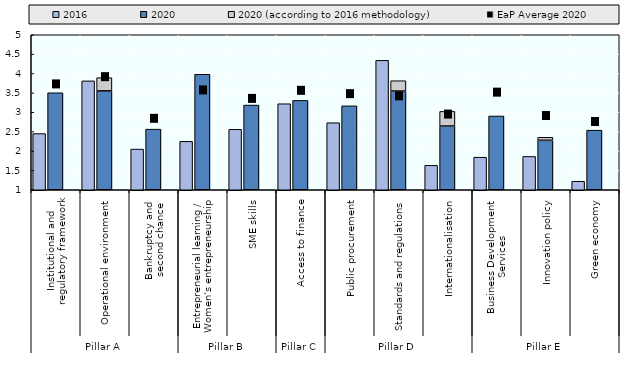
| Category | 2020 | 2020 (according to 2016 methodology) |
|---|---|---|
| 0 | 3.503 | 0 |
| 1 | 3.552 | 0.341 |
| 2 | 2.564 | 0 |
| 3 | 3.981 | 0 |
| 4 | 3.186 | 0 |
| 5 | 3.306 | 0 |
| 6 | 3.166 | 0 |
| 7 | 3.547 | 0.266 |
| 8 | 2.645 | 0.378 |
| 9 | 2.904 | 0 |
| 10 | 2.277 | 0.077 |
| 11 | 2.537 | 0 |